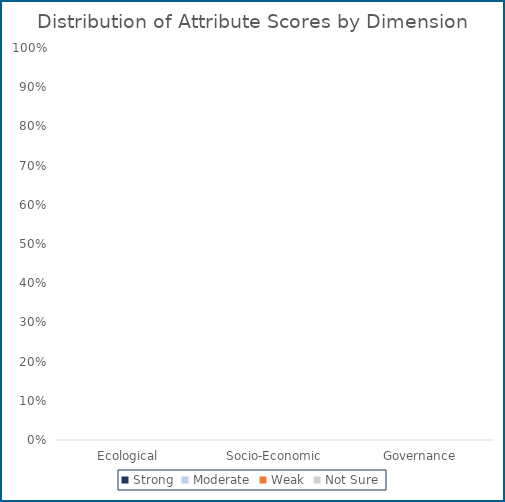
| Category | Strong | Moderate | Weak | Not Sure |
|---|---|---|---|---|
| Ecological | 0 | 0 | 0 | 0 |
| Socio-Economic | 0 | 0 | 0 | 0 |
| Governance | 0 | 0 | 0 | 0 |